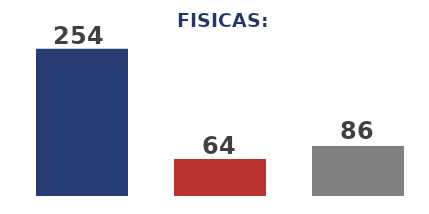
| Category | Series 0 |
|---|---|
| 0 | 254 |
| 1 | 64 |
| 2 | 86 |